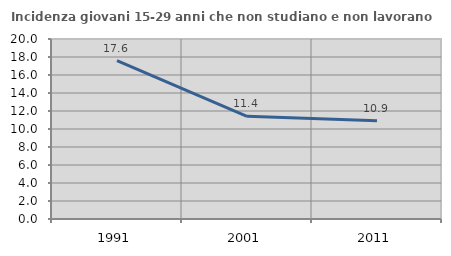
| Category | Incidenza giovani 15-29 anni che non studiano e non lavorano  |
|---|---|
| 1991.0 | 17.589 |
| 2001.0 | 11.407 |
| 2011.0 | 10.909 |